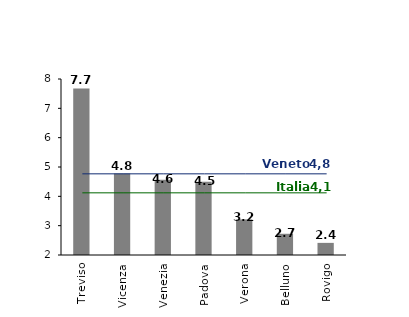
| Category | % |
|---|---|
| Treviso | 7.676 |
| Vicenza | 4.78 |
| Venezia | 4.566 |
| Padova | 4.495 |
| Verona | 3.215 |
| Belluno | 2.724 |
| Rovigo | 2.413 |